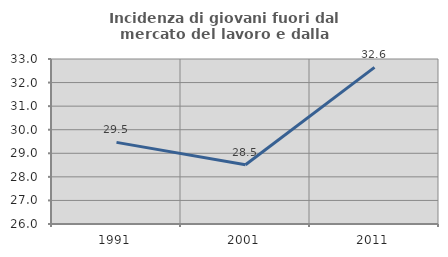
| Category | Incidenza di giovani fuori dal mercato del lavoro e dalla formazione  |
|---|---|
| 1991.0 | 29.463 |
| 2001.0 | 28.516 |
| 2011.0 | 32.643 |